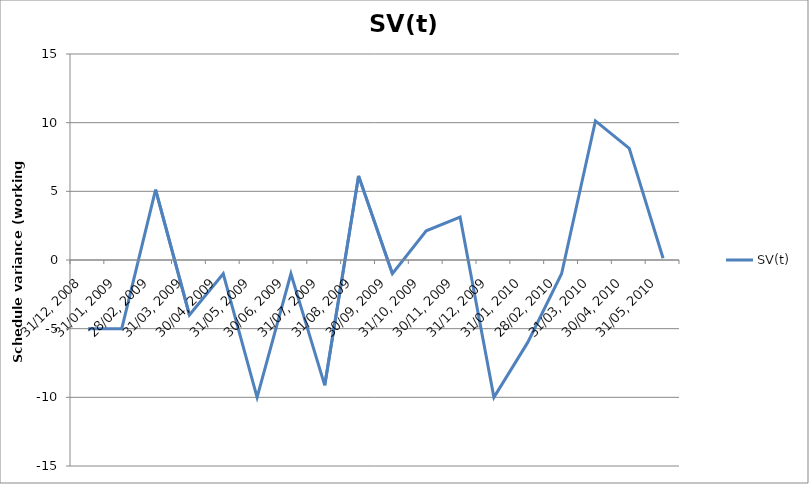
| Category | SV(t) |
|---|---|
| 31/12, 2008 | -5 |
| 31/01, 2009 | -5 |
| 28/02, 2009 | 5.125 |
| 31/03, 2009 | -4 |
| 30/04, 2009 | -1 |
| 31/05, 2009 | -10 |
| 30/06, 2009 | -1 |
| 31/07, 2009 | -9.125 |
| 31/08, 2009 | 6.125 |
| 30/09, 2009 | -1 |
| 31/10, 2009 | 2.125 |
| 30/11, 2009 | 3.125 |
| 31/12, 2009 | -10 |
| 31/01, 2010 | -6 |
| 28/02, 2010 | -1 |
| 31/03, 2010 | 10.125 |
| 30/04, 2010 | 8.125 |
| 31/05, 2010 | 0.125 |